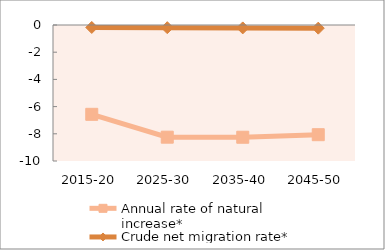
| Category | Annual rate of natural increase* | Crude net migration rate* |
|---|---|---|
| 2015-20 | -6.568 | -0.182 |
| 2025-30 | -8.248 | -0.197 |
| 2035-40 | -8.253 | -0.214 |
| 2045-50 | -8.066 | -0.233 |